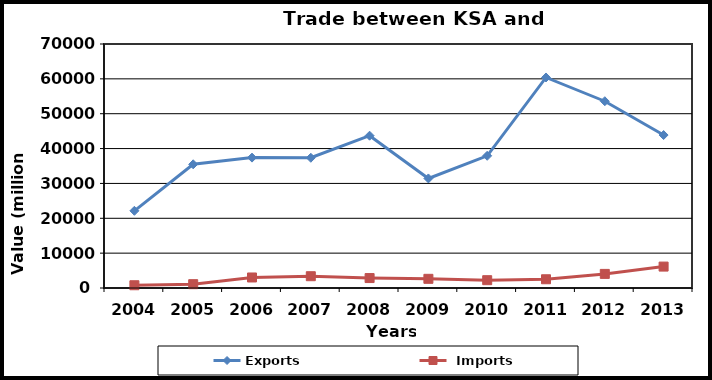
| Category | Exports |  Imports |
|---|---|---|
| 2004.0 | 22147 | 791 |
| 2005.0 | 35488 | 1094 |
| 2006.0 | 37405 | 3020 |
| 2007.0 | 37360 | 3381 |
| 2008.0 | 43693 | 2854 |
| 2009.0 | 31429 | 2635 |
| 2010.0 | 37931 | 2242 |
| 2011.0 | 60398 | 2506 |
| 2012.0 | 53582 | 4044 |
| 2013.0 | 43876 | 6142 |